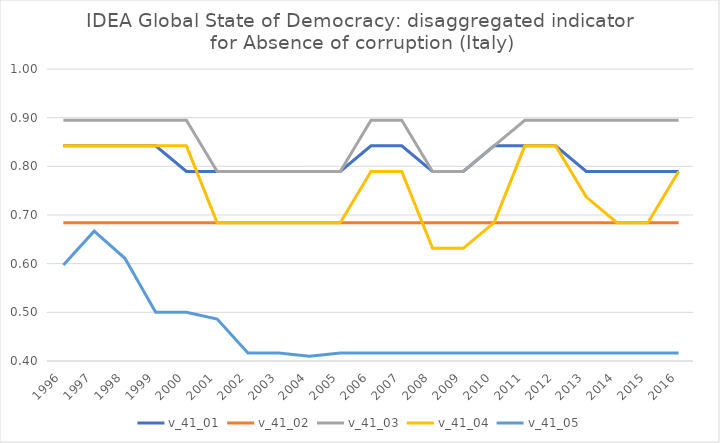
| Category | v_41_01 | v_41_02 | v_41_03 | v_41_04 | v_41_05 |
|---|---|---|---|---|---|
| 1996.0 | 0.842 | 0.684 | 0.895 | 0.842 | 0.597 |
| 1997.0 | 0.842 | 0.684 | 0.895 | 0.842 | 0.667 |
| 1998.0 | 0.842 | 0.684 | 0.895 | 0.842 | 0.611 |
| 1999.0 | 0.842 | 0.684 | 0.895 | 0.842 | 0.5 |
| 2000.0 | 0.789 | 0.684 | 0.895 | 0.842 | 0.5 |
| 2001.0 | 0.789 | 0.684 | 0.789 | 0.684 | 0.486 |
| 2002.0 | 0.789 | 0.684 | 0.789 | 0.684 | 0.417 |
| 2003.0 | 0.789 | 0.684 | 0.789 | 0.684 | 0.417 |
| 2004.0 | 0.789 | 0.684 | 0.789 | 0.684 | 0.41 |
| 2005.0 | 0.789 | 0.684 | 0.789 | 0.684 | 0.417 |
| 2006.0 | 0.842 | 0.684 | 0.895 | 0.789 | 0.417 |
| 2007.0 | 0.842 | 0.684 | 0.895 | 0.789 | 0.417 |
| 2008.0 | 0.789 | 0.684 | 0.789 | 0.632 | 0.417 |
| 2009.0 | 0.789 | 0.684 | 0.789 | 0.632 | 0.417 |
| 2010.0 | 0.842 | 0.684 | 0.842 | 0.684 | 0.417 |
| 2011.0 | 0.842 | 0.684 | 0.895 | 0.842 | 0.417 |
| 2012.0 | 0.842 | 0.684 | 0.895 | 0.842 | 0.417 |
| 2013.0 | 0.789 | 0.684 | 0.895 | 0.737 | 0.417 |
| 2014.0 | 0.789 | 0.684 | 0.895 | 0.684 | 0.417 |
| 2015.0 | 0.789 | 0.684 | 0.895 | 0.684 | 0.417 |
| 2016.0 | 0.789 | 0.684 | 0.895 | 0.789 | 0.417 |